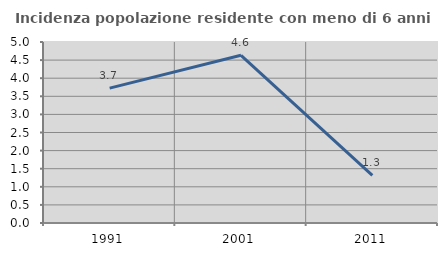
| Category | Incidenza popolazione residente con meno di 6 anni |
|---|---|
| 1991.0 | 3.727 |
| 2001.0 | 4.633 |
| 2011.0 | 1.316 |